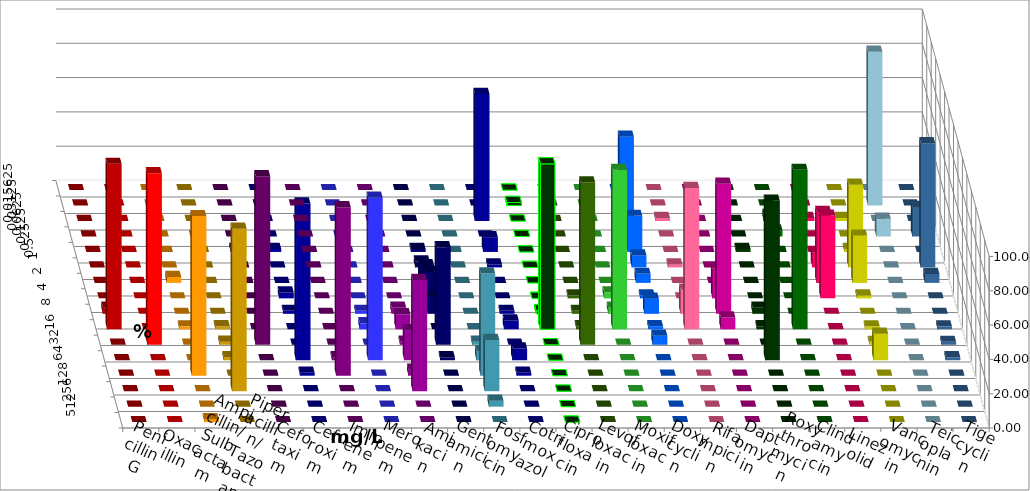
| Category | Penicillin G | Oxacillin | Ampicillin/ Sulbactam | Piperacillin/ Tazobactam | Cefotaxim | Cefuroxim | Imipenem | Meropenem | Amikacin | Gentamicin | Fosfomycin | Cotrimoxazol | Ciprofloxacin | Levofloxacin | Moxifloxacin | Doxycyclin | Rifampicin | Daptomycin | Roxythromycin | Clindamycin | Linezolid | Vancomycin | Teicoplanin | Tigecyclin |
|---|---|---|---|---|---|---|---|---|---|---|---|---|---|---|---|---|---|---|---|---|---|---|---|---|
| 0.015625 | 0 | 0 | 0 | 0 | 0 | 0 | 0 | 0 | 0 | 0 | 0 | 0 | 0 | 0 | 0 | 0 | 0 | 0 | 0 | 0 | 0 | 0 | 0 | 0 |
| 0.03125 | 0 | 0 | 0 | 0 | 0 | 0 | 0 | 0 | 0 | 0 | 0 | 0 | 1.754 | 0 | 0 | 0 | 0 | 0 | 0 | 0 | 0 | 0 | 0 | 89.655 |
| 0.0625 | 0 | 0 | 0 | 0 | 0 | 0 | 0 | 0 | 0 | 0 | 0 | 74.138 | 0 | 0 | 0 | 49.123 | 1.754 | 0 | 0 | 3.509 | 1.724 | 1.724 | 0 | 0 |
| 0.125 | 0 | 0 | 0 | 0 | 0 | 0 | 0 | 0 | 0 | 0 | 0 | 0 | 0 | 0 | 0 | 0 | 0 | 0 | 0 | 3.509 | 0 | 0 | 17.241 | 10.345 |
| 0.25 | 0 | 0 | 0 | 0 | 1.754 | 0 | 1.724 | 0 | 0 | 1.724 | 0 | 8.621 | 0 | 0 | 0 | 21.053 | 0 | 0 | 1.754 | 0 | 0 | 1.724 | 0 | 0 |
| 0.5 | 0 | 0 | 0 | 0 | 0 | 0 | 0 | 0 | 0 | 3.448 | 0 | 1.724 | 0 | 0 | 0 | 7.018 | 1.754 | 0 | 0 | 0 | 8.621 | 48.276 | 72.414 | 0 |
| 1.0 | 0 | 0 | 3.448 | 0 | 0 | 0 | 0 | 0 | 0 | 10.345 | 0 | 0 | 0 | 0 | 0 | 5.263 | 0 | 0 | 0 | 0 | 41.379 | 27.586 | 5.172 | 0 |
| 2.0 | 0 | 0 | 0 | 0 | 0 | 0 | 3.448 | 0 | 0 | 15.517 | 0 | 0 | 0 | 1.754 | 3.509 | 1.754 | 0 | 17.241 | 0 | 0 | 48.276 | 1.724 | 0 | 0 |
| 4.0 | 3.509 | 0 | 0 | 0 | 0 | 0 | 1.724 | 1.754 | 3.509 | 10.345 | 0 | 1.724 | 1.754 | 1.754 | 3.509 | 8.772 | 14.035 | 75.862 | 3.509 | 0 | 0 | 0 | 0 | 0 |
| 8.0 | 96.491 | 0 | 1.724 | 1.754 | 0 | 0 | 0 | 3.509 | 8.772 | 0 | 0 | 5.172 | 96.491 | 1.754 | 92.982 | 1.754 | 82.456 | 6.897 | 1.754 | 92.982 | 0 | 1.724 | 1.724 | 0 |
| 16.0 | 0 | 100 | 0 | 1.754 | 98.246 | 0 | 0 | 0 | 1.754 | 56.897 | 1.754 | 0 | 0 | 94.737 | 0 | 5.263 | 0 | 0 | 0 | 0 | 0 | 1.724 | 1.724 | 0 |
| 32.0 | 0 | 0 | 0 | 1.754 | 0 | 1.754 | 91.379 | 94.737 | 17.544 | 1.724 | 5.263 | 6.897 | 0 | 0 | 0 | 0 | 0 | 0 | 92.982 | 0 | 0 | 15.517 | 1.724 | 0 |
| 64.0 | 0 | 0 | 93.103 | 0 | 0 | 98.246 | 1.724 | 0 | 3.509 | 0 | 59.649 | 1.724 | 0 | 0 | 0 | 0 | 0 | 0 | 0 | 0 | 0 | 0 | 0 | 0 |
| 128.0 | 0 | 0 | 0 | 94.737 | 0 | 0 | 0 | 0 | 64.912 | 0 | 29.825 | 0 | 0 | 0 | 0 | 0 | 0 | 0 | 0 | 0 | 0 | 0 | 0 | 0 |
| 256.0 | 0 | 0 | 0 | 0 | 0 | 0 | 0 | 0 | 0 | 0 | 3.509 | 0 | 0 | 0 | 0 | 0 | 0 | 0 | 0 | 0 | 0 | 0 | 0 | 0 |
| 512.0 | 0 | 0 | 1.724 | 0 | 0 | 0 | 0 | 0 | 0 | 0 | 0 | 0 | 0 | 0 | 0 | 0 | 0 | 0 | 0 | 0 | 0 | 0 | 0 | 0 |